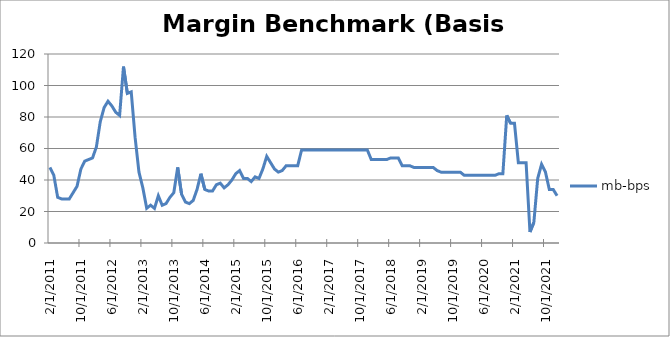
| Category | mb-bps |
|---|---|
| 2/9/11 | 48 |
| 3/9/11 | 43 |
| 4/15/11 | 29 |
| 5/15/11 | 28 |
| 6/15/11 | 28 |
| 7/15/11 | 28 |
| 8/15/11 | 32 |
| 9/15/11 | 36 |
| 10/15/11 | 47 |
| 11/15/11 | 52 |
| 12/15/11 | 53 |
| 1/15/12 | 54 |
| 2/15/12 | 61 |
| 3/15/12 | 77 |
| 4/15/12 | 86 |
| 5/15/12 | 90 |
| 6/15/12 | 87 |
| 7/15/12 | 83 |
| 8/15/12 | 81 |
| 9/15/12 | 112 |
| 10/15/12 | 95 |
| 11/15/12 | 96 |
| 12/15/12 | 67 |
| 1/15/13 | 45 |
| 2/15/13 | 35 |
| 3/15/13 | 22 |
| 4/15/13 | 24 |
| 5/15/13 | 22 |
| 6/15/13 | 30 |
| 7/15/13 | 24 |
| 8/15/13 | 25 |
| 9/15/13 | 29 |
| 10/15/13 | 32 |
| 11/15/13 | 48 |
| 12/15/13 | 31 |
| 1/15/14 | 26 |
| 2/15/14 | 25 |
| 3/15/14 | 27 |
| 4/15/14 | 34 |
| 5/15/14 | 44 |
| 6/15/14 | 34 |
| 7/15/14 | 33 |
| 8/15/14 | 33 |
| 9/15/14 | 37 |
| 10/15/14 | 38 |
| 11/15/14 | 35 |
| 12/15/14 | 37 |
| 1/15/15 | 40 |
| 2/15/15 | 44 |
| 3/15/15 | 46 |
| 4/15/15 | 41 |
| 5/15/15 | 41 |
| 6/15/15 | 39 |
| 7/15/15 | 42 |
| 8/15/15 | 41 |
| 9/15/15 | 47 |
| 10/15/15 | 55 |
| 11/15/15 | 51 |
| 12/15/15 | 47 |
| 1/15/16 | 45 |
| 2/15/16 | 46 |
| 3/15/16 | 49 |
| 4/15/16 | 49 |
| 5/15/16 | 49 |
| 6/15/16 | 49 |
| 7/15/16 | 59 |
| 8/15/16 | 59 |
| 9/15/16 | 59 |
| 10/15/16 | 59 |
| 11/15/16 | 59 |
| 12/15/16 | 59 |
| 1/15/17 | 59 |
| 2/15/17 | 59 |
| 3/15/17 | 59 |
| 4/15/17 | 59 |
| 5/15/17 | 59 |
| 6/15/17 | 59 |
| 7/15/17 | 59 |
| 8/15/17 | 59 |
| 9/15/17 | 59 |
| 10/15/17 | 59 |
| 11/15/17 | 59 |
| 12/15/17 | 59 |
| 1/15/18 | 53 |
| 2/15/18 | 53 |
| 3/15/18 | 53 |
| 4/15/18 | 53 |
| 5/15/18 | 53 |
| 6/15/18 | 54 |
| 7/15/18 | 54 |
| 8/15/18 | 54 |
| 9/15/18 | 49 |
| 10/15/18 | 49 |
| 11/15/18 | 49 |
| 12/15/18 | 48 |
| 1/15/19 | 48 |
| 2/15/19 | 48 |
| 3/15/19 | 48 |
| 4/15/19 | 48 |
| 5/15/19 | 48 |
| 6/15/19 | 46 |
| 7/15/19 | 45 |
| 8/15/19 | 45 |
| 9/15/19 | 45 |
| 10/15/19 | 45 |
| 11/15/19 | 45 |
| 12/15/19 | 45 |
| 1/15/20 | 43 |
| 2/15/20 | 43 |
| 3/15/20 | 43 |
| 4/15/20 | 43 |
| 5/15/20 | 43 |
| 6/15/20 | 43 |
| 7/15/20 | 43 |
| 8/15/20 | 43 |
| 9/15/20 | 43 |
| 10/15/20 | 44 |
| 11/15/20 | 44 |
| 12/15/20 | 81 |
| 1/15/21 | 76 |
| 2/15/21 | 76 |
| 3/15/21 | 51 |
| 4/15/21 | 51 |
| 5/15/21 | 51 |
| 6/15/21 | 7 |
| 7/15/21 | 13 |
| 8/15/21 | 41 |
| 9/15/21 | 50 |
| 10/15/21 | 45 |
| 11/15/21 | 34 |
| 12/15/21 | 34 |
| 1/15/22 | 30 |